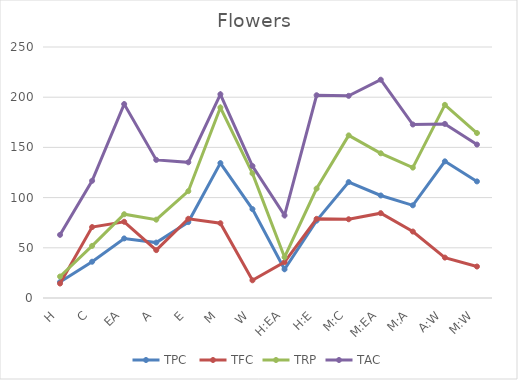
| Category | TPC  | TFC | TRP | TAC |
|---|---|---|---|---|
| H | 15.9 | 14.405 | 21.401 | 62.9 |
| C | 36.137 | 70.649 | 51.919 | 116.736 |
| EA | 59.321 | 75.938 | 83.434 | 193.145 |
| A | 55.182 | 47.687 | 78.029 | 137.556 |
| E | 75.616 | 78.905 | 106.409 | 135.151 |
| M | 134.352 | 74.454 | 189.717 | 202.902 |
| W | 88.498 | 17.63 | 124.142 | 131.435 |
| H:EA | 28.593 | 35.69 | 40.615 | 82.231 |
| H:E | 77.092 | 78.84 | 108.986 | 201.944 |
| M:C | 115.427 | 78.437 | 161.969 | 201.35 |
| M:EA | 102.116 | 84.5 | 144.135 | 217.412 |
| M:A | 92.315 | 66.182 | 129.874 | 172.81 |
| A:W | 136.123 | 40.253 | 192.375 | 173.406 |
| M:W | 116.129 | 31.352 | 164.316 | 152.849 |